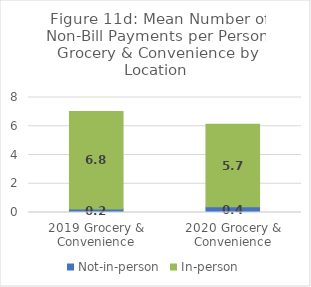
| Category | Not-in-person | In-person |
|---|---|---|
| 2019 Grocery & Convenience | 0.24 | 6.783 |
| 2020 Grocery & Convenience | 0.397 | 5.743 |